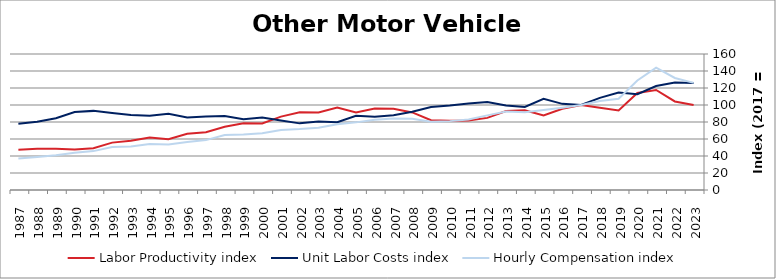
| Category | Labor Productivity index | Unit Labor Costs index | Hourly Compensation index |
|---|---|---|---|
| 2023.0 | 100.016 | 125.99 | 126.01 |
| 2022.0 | 104.177 | 126.506 | 131.791 |
| 2021.0 | 117.68 | 122.278 | 143.897 |
| 2020.0 | 114.233 | 112.758 | 128.806 |
| 2019.0 | 93.63 | 114.713 | 107.406 |
| 2018.0 | 96.686 | 108.381 | 104.789 |
| 2017.0 | 100 | 100 | 100 |
| 2016.0 | 95.482 | 101.337 | 96.758 |
| 2015.0 | 87.649 | 107.234 | 93.989 |
| 2014.0 | 93.76 | 97.687 | 91.591 |
| 2013.0 | 93.012 | 99.407 | 92.46 |
| 2012.0 | 84.857 | 103.477 | 87.808 |
| 2011.0 | 81.641 | 101.757 | 83.076 |
| 2010.0 | 81.475 | 99.452 | 81.029 |
| 2009.0 | 82.033 | 97.749 | 80.186 |
| 2008.0 | 91.242 | 91.992 | 83.936 |
| 2007.0 | 95.608 | 87.849 | 83.991 |
| 2006.0 | 95.989 | 86.108 | 82.655 |
| 2005.0 | 91.095 | 87.343 | 79.565 |
| 2004.0 | 97.128 | 79.752 | 77.462 |
| 2003.0 | 91.111 | 80.506 | 73.35 |
| 2002.0 | 91.418 | 78.393 | 71.665 |
| 2001.0 | 86.298 | 81.832 | 70.619 |
| 2000.0 | 78.257 | 85.364 | 66.803 |
| 1999.0 | 78.526 | 83.21 | 65.341 |
| 1998.0 | 74.441 | 87.019 | 64.778 |
| 1997.0 | 67.998 | 86.332 | 58.704 |
| 1996.0 | 66.051 | 85.403 | 56.41 |
| 1995.0 | 59.822 | 89.677 | 53.647 |
| 1994.0 | 61.868 | 87.495 | 54.131 |
| 1993.0 | 58.036 | 88.123 | 51.142 |
| 1992.0 | 55.73 | 90.595 | 50.489 |
| 1991.0 | 49.146 | 93.085 | 45.748 |
| 1990.0 | 47.6 | 91.802 | 43.697 |
| 1989.0 | 48.42 | 84.399 | 40.866 |
| 1988.0 | 48.538 | 80.184 | 38.92 |
| 1987.0 | 47.457 | 77.996 | 37.015 |